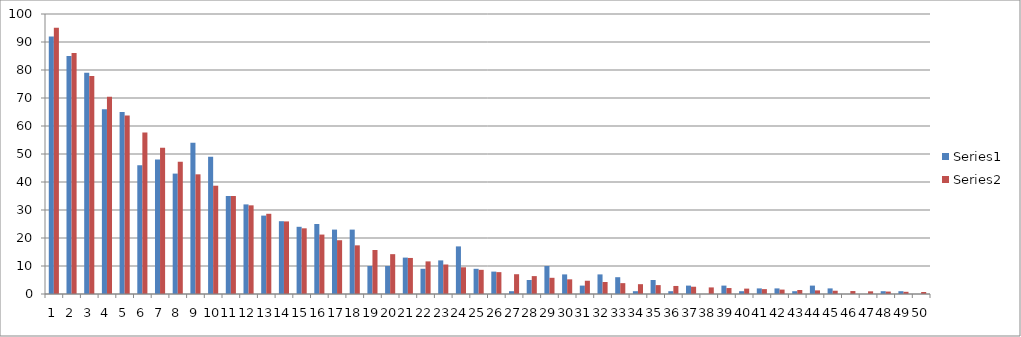
| Category | Series 0 | Series 1 |
|---|---|---|
| 0 | 92 | 95.123 |
| 1 | 85 | 86.071 |
| 2 | 79 | 77.88 |
| 3 | 66 | 70.469 |
| 4 | 65 | 63.763 |
| 5 | 46 | 57.695 |
| 6 | 48 | 52.205 |
| 7 | 43 | 47.237 |
| 8 | 54 | 42.741 |
| 9 | 49 | 38.674 |
| 10 | 35 | 34.994 |
| 11 | 32 | 31.664 |
| 12 | 28 | 28.65 |
| 13 | 26 | 25.924 |
| 14 | 24 | 23.457 |
| 15 | 25 | 21.225 |
| 16 | 23 | 19.205 |
| 17 | 23 | 17.377 |
| 18 | 10 | 15.724 |
| 19 | 10 | 14.227 |
| 20 | 13 | 12.873 |
| 21 | 9 | 11.648 |
| 22 | 12 | 10.54 |
| 23 | 17 | 9.537 |
| 24 | 9 | 8.629 |
| 25 | 8 | 7.808 |
| 26 | 1 | 7.065 |
| 27 | 5 | 6.393 |
| 28 | 10 | 5.784 |
| 29 | 7 | 5.234 |
| 30 | 3 | 4.736 |
| 31 | 7 | 4.285 |
| 32 | 6 | 3.877 |
| 33 | 1 | 3.508 |
| 34 | 5 | 3.175 |
| 35 | 1 | 2.872 |
| 36 | 3 | 2.599 |
| 37 | 0 | 2.352 |
| 38 | 3 | 2.128 |
| 39 | 1 | 1.925 |
| 40 | 2 | 1.742 |
| 41 | 2 | 1.576 |
| 42 | 1 | 1.426 |
| 43 | 3 | 1.291 |
| 44 | 2 | 1.168 |
| 45 | 0 | 1.057 |
| 46 | 0 | 0.956 |
| 47 | 1 | 0.865 |
| 48 | 1 | 0.783 |
| 49 | 0 | 0.708 |